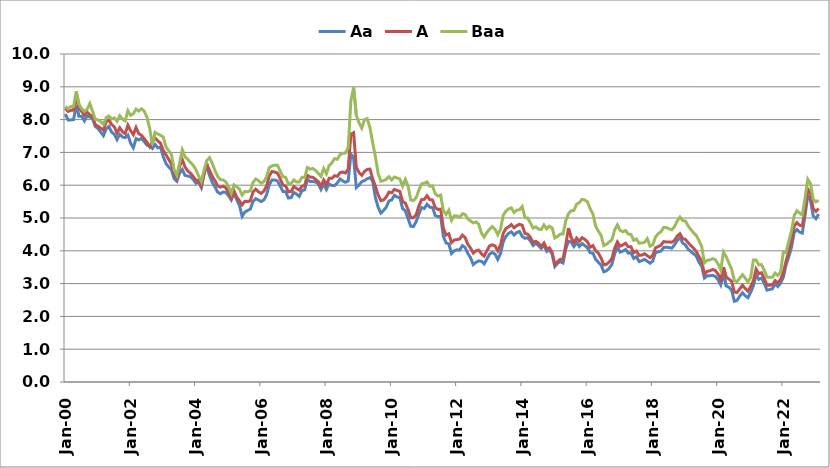
| Category | Aa | A | Baa |
|---|---|---|---|
| 2000-01-01 | 8.17 | 8.35 | 8.4 |
| 2000-02-01 | 7.99 | 8.25 | 8.33 |
| 2000-03-01 | 7.99 | 8.28 | 8.4 |
| 2000-04-01 | 8 | 8.29 | 8.4 |
| 2000-05-01 | 8.44 | 8.7 | 8.86 |
| 2000-06-01 | 8.1 | 8.36 | 8.47 |
| 2000-07-01 | 8.1 | 8.25 | 8.33 |
| 2000-08-01 | 7.96 | 8.13 | 8.25 |
| 2000-09-01 | 8.11 | 8.23 | 8.32 |
| 2000-10-01 | 8.08 | 8.14 | 8.49 |
| 2000-11-01 | 8.03 | 8.11 | 8.25 |
| 2000-12-01 | 7.79 | 7.84 | 8.01 |
| 2001-01-01 | 7.73 | 7.8 | 7.99 |
| 2001-02-01 | 7.62 | 7.74 | 7.94 |
| 2001-03-01 | 7.51 | 7.68 | 7.85 |
| 2001-04-01 | 7.72 | 7.94 | 8.06 |
| 2001-05-01 | 7.79 | 7.99 | 8.11 |
| 2001-06-01 | 7.62 | 7.85 | 8.02 |
| 2001-07-01 | 7.55 | 7.78 | 8.05 |
| 2001-08-01 | 7.39 | 7.59 | 7.95 |
| 2001-09-01 | 7.55 | 7.75 | 8.12 |
| 2001-10-01 | 7.47 | 7.63 | 8.02 |
| 2001-11-01 | 7.45 | 7.57 | 7.96 |
| 2001-12-01 | 7.53 | 7.83 | 8.27 |
| 2002-01-01 | 7.28 | 7.66 | 8.13 |
| 2002-02-01 | 7.14 | 7.54 | 8.18 |
| 2002-03-01 | 7.42 | 7.76 | 8.32 |
| 2002-04-01 | 7.38 | 7.57 | 8.26 |
| 2002-05-01 | 7.43 | 7.52 | 8.33 |
| 2002-06-01 | 7.33 | 7.42 | 8.26 |
| 2002-07-01 | 7.22 | 7.31 | 8.07 |
| 2002-08-01 | 7.2 | 7.17 | 7.74 |
| 2002-09-01 | 7.12 | 7.32 | 7.23 |
| 2002-10-01 | 7.24 | 7.44 | 7.61 |
| 2002-11-01 | 7.14 | 7.35 | 7.56 |
| 2002-12-01 | 7.16 | 7.28 | 7.52 |
| 2003-01-01 | 6.87 | 7.06 | 7.47 |
| 2003-02-01 | 6.66 | 6.93 | 7.17 |
| 2003-03-01 | 6.56 | 6.79 | 7.05 |
| 2003-04-01 | 6.47 | 6.64 | 6.94 |
| 2003-05-01 | 6.2 | 6.36 | 6.47 |
| 2003-06-01 | 6.12 | 6.21 | 6.3 |
| 2003-07-01 | 6.37 | 6.57 | 6.67 |
| 2003-08-01 | 6.48 | 6.78 | 7.08 |
| 2003-09-01 | 6.3 | 6.56 | 6.87 |
| 2003-10-01 | 6.28 | 6.43 | 6.79 |
| 2003-11-01 | 6.26 | 6.37 | 6.69 |
| 2003-12-01 | 6.18 | 6.27 | 6.61 |
| 2004-01-01 | 6.06 | 6.15 | 6.47 |
| 2004-02-01 | 6.1 | 6.15 | 6.28 |
| 2004-03-01 | 5.93 | 5.97 | 6.12 |
| 2004-04-01 | 6.33 | 6.35 | 6.46 |
| 2004-05-01 | 6.66 | 6.62 | 6.75 |
| 2004-06-01 | 6.3 | 6.46 | 6.84 |
| 2004-07-01 | 6.09 | 6.27 | 6.67 |
| 2004-08-01 | 5.95 | 6.14 | 6.45 |
| 2004-09-01 | 5.79 | 5.98 | 6.27 |
| 2004-10-01 | 5.74 | 5.94 | 6.17 |
| 2004-11-01 | 5.79 | 5.97 | 6.16 |
| 2004-12-01 | 5.78 | 5.92 | 6.1 |
| 2005-01-01 | 5.68 | 5.78 | 5.95 |
| 2005-02-01 | 5.55 | 5.61 | 5.76 |
| 2005-03-01 | 5.76 | 5.83 | 6.01 |
| 2005-04-01 | 5.56 | 5.64 | 5.95 |
| 2005-05-01 | 5.39 | 5.53 | 5.88 |
| 2005-06-01 | 5.05 | 5.4 | 5.7 |
| 2005-07-01 | 5.18 | 5.51 | 5.81 |
| 2005-08-01 | 5.23 | 5.5 | 5.8 |
| 2005-09-01 | 5.27 | 5.52 | 5.83 |
| 2005-10-01 | 5.5 | 5.79 | 6.08 |
| 2005-11-01 | 5.59 | 5.88 | 6.19 |
| 2005-12-01 | 5.55 | 5.8 | 6.14 |
| 2006-01-01 | 5.5 | 5.75 | 6.06 |
| 2006-02-01 | 5.55 | 5.82 | 6.11 |
| 2006-03-01 | 5.71 | 5.98 | 6.26 |
| 2006-04-01 | 6.02 | 6.29 | 6.54 |
| 2006-05-01 | 6.16 | 6.42 | 6.59 |
| 2006-06-01 | 6.16 | 6.4 | 6.61 |
| 2006-07-01 | 6.13 | 6.37 | 6.61 |
| 2006-08-01 | 5.97 | 6.2 | 6.43 |
| 2006-09-01 | 5.81 | 6 | 6.26 |
| 2006-10-01 | 5.8 | 5.98 | 6.24 |
| 2006-11-01 | 5.61 | 5.8 | 6.04 |
| 2006-12-01 | 5.62 | 5.81 | 6.05 |
| 2007-01-01 | 5.78 | 5.96 | 6.16 |
| 2007-02-01 | 5.73 | 5.9 | 6.1 |
| 2007-03-01 | 5.66 | 5.85 | 6.1 |
| 2007-04-01 | 5.83 | 5.97 | 6.24 |
| 2007-05-01 | 5.86 | 5.99 | 6.23 |
| 2007-06-01 | 6.18 | 6.3 | 6.54 |
| 2007-07-01 | 6.11 | 6.25 | 6.49 |
| 2007-08-01 | 6.11 | 6.24 | 6.51 |
| 2007-09-01 | 6.1 | 6.18 | 6.45 |
| 2007-10-01 | 6.04 | 6.11 | 6.36 |
| 2007-11-01 | 5.87 | 5.97 | 6.27 |
| 2007-12-01 | 6.03 | 6.16 | 6.51 |
| 2008-01-01 | 5.87 | 6.02 | 6.35 |
| 2008-02-01 | 6.04 | 6.21 | 6.6 |
| 2008-03-01 | 5.99 | 6.21 | 6.68 |
| 2008-04-01 | 5.99 | 6.29 | 6.81 |
| 2008-05-01 | 6.07 | 6.27 | 6.79 |
| 2008-06-01 | 6.19 | 6.38 | 6.93 |
| 2008-07-01 | 6.13 | 6.4 | 6.97 |
| 2008-08-01 | 6.09 | 6.37 | 6.98 |
| 2008-09-01 | 6.13 | 6.49 | 7.15 |
| 2008-10-01 | 6.95 | 7.56 | 8.58 |
| 2008-11-01 | 6.83 | 7.6 | 8.98 |
| 2008-12-01 | 5.93 | 6.54 | 8.13 |
| 2009-01-01 | 6.01 | 6.39 | 7.9 |
| 2009-02-01 | 6.11 | 6.3 | 7.74 |
| 2009-03-01 | 6.14 | 6.42 | 8 |
| 2009-04-01 | 6.2 | 6.48 | 8.03 |
| 2009-05-01 | 6.23 | 6.49 | 7.76 |
| 2009-06-01 | 6.13 | 6.2 | 7.3 |
| 2009-07-01 | 5.63 | 5.97 | 6.87 |
| 2009-08-01 | 5.33 | 5.71 | 6.36 |
| 2009-09-01 | 5.15 | 5.53 | 6.12 |
| 2009-10-01 | 5.23 | 5.55 | 6.14 |
| 2009-11-01 | 5.33 | 5.64 | 6.18 |
| 2009-12-01 | 5.52 | 5.79 | 6.26 |
| 2010-01-01 | 5.55 | 5.77 | 6.16 |
| 2010-02-01 | 5.69 | 5.87 | 6.25 |
| 2010-03-01 | 5.64 | 5.84 | 6.22 |
| 2010-04-01 | 5.62 | 5.81 | 6.19 |
| 2010-05-01 | 5.29 | 5.5 | 5.97 |
| 2010-06-01 | 5.22 | 5.46 | 6.18 |
| 2010-07-01 | 4.99 | 5.26 | 5.98 |
| 2010-08-01 | 4.75 | 5.01 | 5.55 |
| 2010-09-01 | 4.74 | 5.01 | 5.53 |
| 2010-10-01 | 4.89 | 5.1 | 5.62 |
| 2010-11-01 | 5.12 | 5.37 | 5.85 |
| 2010-12-01 | 5.32 | 5.56 | 6.04 |
| 2011-01-01 | 5.29 | 5.57 | 6.06 |
| 2011-02-01 | 5.42 | 5.68 | 6.1 |
| 2011-03-01 | 5.33 | 5.56 | 5.97 |
| 2011-04-01 | 5.32 | 5.55 | 5.98 |
| 2011-05-01 | 5.08 | 5.32 | 5.74 |
| 2011-06-01 | 5.04 | 5.26 | 5.67 |
| 2011-07-01 | 5.05 | 5.27 | 5.7 |
| 2011-08-01 | 4.44 | 4.69 | 5.22 |
| 2011-09-01 | 4.24 | 4.48 | 5.11 |
| 2011-10-01 | 4.21 | 4.52 | 5.24 |
| 2011-11-01 | 3.92 | 4.25 | 4.93 |
| 2011-12-01 | 4 | 4.33 | 5.07 |
| 2012-01-01 | 4.03 | 4.34 | 5.06 |
| 2012-02-01 | 4.02 | 4.36 | 5.02 |
| 2012-03-01 | 4.16 | 4.48 | 5.13 |
| 2012-04-01 | 4.1 | 4.4 | 5.11 |
| 2012-05-01 | 3.92 | 4.2 | 4.97 |
| 2012-06-01 | 3.79 | 4.08 | 4.91 |
| 2012-07-01 | 3.58 | 3.93 | 4.85 |
| 2012-08-01 | 3.65 | 4 | 4.88 |
| 2012-09-01 | 3.69 | 4.02 | 4.81 |
| 2012-10-01 | 3.68 | 3.91 | 4.54 |
| 2012-11-01 | 3.6 | 3.84 | 4.42 |
| 2012-12-01 | 3.75 | 4 | 4.56 |
| 2013-01-01 | 3.9 | 4.15 | 4.66 |
| 2013-02-01 | 3.95 | 4.18 | 4.74 |
| 2013-03-01 | 3.9 | 4.15 | 4.66 |
| 2013-04-01 | 3.74 | 4 | 4.49 |
| 2013-05-01 | 3.91 | 4.17 | 4.65 |
| 2013-06-01 | 4.27 | 4.53 | 5.08 |
| 2013-07-01 | 4.44 | 4.68 | 5.21 |
| 2013-08-01 | 4.53 | 4.73 | 5.28 |
| 2013-09-01 | 4.58 | 4.8 | 5.31 |
| 2013-10-01 | 4.48 | 4.7 | 5.17 |
| 2013-11-01 | 4.56 | 4.77 | 5.24 |
| 2013-12-01 | 4.59 | 4.81 | 5.25 |
| 2014-01-01 | 4.44 | 4.778 | 5.351 |
| 2014-02-01 | 4.38 | 4.53 | 5.01 |
| 2014-03-01 | 4.4 | 4.51 | 5 |
| 2014-04-01 | 4.3 | 4.41 | 4.85 |
| 2014-05-01 | 4.16 | 4.26 | 4.69 |
| 2014-06-01 | 4.23 | 4.29 | 4.73 |
| 2014-07-01 | 4.16 | 4.23 | 4.66 |
| 2014-08-01 | 4.07 | 4.13 | 4.65 |
| 2014-09-01 | 4.18 | 4.24 | 4.79 |
| 2014-10-01 | 3.98 | 4.06 | 4.67 |
| 2014-11-01 | 4.03 | 4.09 | 4.75 |
| 2014-12-01 | 3.9 | 3.95 | 4.7 |
| 2015-01-01 | 3.52 | 3.58 | 4.39 |
| 2015-02-01 | 3.62 | 3.67 | 4.44 |
| 2015-03-01 | 3.67 | 3.74 | 4.51 |
| 2015-04-01 | 3.63 | 3.75 | 4.51 |
| 2015-05-01 | 4.05 | 4.17 | 4.91 |
| 2015-06-01 | 4.29 | 4.69 | 5.13 |
| 2015-07-01 | 4.27 | 4.4 | 5.22 |
| 2015-08-01 | 4.13 | 4.25 | 5.23 |
| 2015-09-01 | 4.25 | 4.39 | 5.42 |
| 2015-10-01 | 4.13 | 4.29 | 5.47 |
| 2015-11-01 | 4.22 | 4.4 | 5.57 |
| 2015-12-01 | 4.16 | 4.35 | 5.55 |
| 2016-01-01 | 4.09 | 4.27 | 5.49 |
| 2016-02-01 | 3.94 | 4.11 | 5.28 |
| 2016-03-01 | 3.93 | 4.16 | 5.12 |
| 2016-04-01 | 3.74 | 4 | 4.75 |
| 2016-05-01 | 3.65 | 3.93 | 4.6 |
| 2016-06-01 | 3.56 | 3.78 | 4.47 |
| 2016-07-01 | 3.36 | 3.57 | 4.16 |
| 2016-08-01 | 3.39 | 3.59 | 4.2 |
| 2016-09-01 | 3.47 | 3.66 | 4.27 |
| 2016-10-01 | 3.59 | 3.77 | 4.34 |
| 2016-11-01 | 3.91 | 4.08 | 4.64 |
| 2016-12-01 | 4.11 | 4.27 | 4.79 |
| 2017-01-01 | 3.96 | 4.14 | 4.62 |
| 2017-02-01 | 3.99 | 4.18 | 4.58 |
| 2017-03-01 | 4.04 | 4.23 | 4.62 |
| 2017-04-01 | 3.93 | 4.12 | 4.51 |
| 2017-05-01 | 3.94 | 4.12 | 4.5 |
| 2017-06-01 | 3.77 | 3.94 | 4.32 |
| 2017-07-01 | 3.82 | 3.99 | 4.36 |
| 2017-08-01 | 3.67 | 3.86 | 4.23 |
| 2017-09-01 | 3.7 | 3.87 | 4.24 |
| 2017-10-01 | 3.74 | 3.91 | 4.26 |
| 2017-11-01 | 3.68 | 3.85 | 4.37 |
| 2017-12-01 | 3.62 | 3.79 | 4.14 |
| 2018-01-01 | 3.69 | 3.86 | 4.18 |
| 2018-02-01 | 3.94 | 4.09 | 4.42 |
| 2018-03-01 | 3.97 | 4.13 | 4.52 |
| 2018-04-01 | 3.99 | 4.17 | 4.58 |
| 2018-05-01 | 4.1 | 4.28 | 4.71 |
| 2018-06-01 | 4.11 | 4.27 | 4.71 |
| 2018-07-01 | 4.1 | 4.27 | 4.67 |
| 2018-08-01 | 4.08 | 4.26 | 4.64 |
| 2018-09-01 | 4.18 | 4.32 | 4.74 |
| 2018-10-01 | 4.31 | 4.45 | 4.91 |
| 2018-11-01 | 4.4 | 4.52 | 5.03 |
| 2018-12-01 | 4.24 | 4.37 | 4.92 |
| 2019-01-01 | 4.18 | 4.35 | 4.91 |
| 2019-02-01 | 4.05 | 4.25 | 4.76 |
| 2019-03-01 | 3.98 | 4.16 | 4.65 |
| 2019-04-01 | 3.91 | 4.08 | 4.55 |
| 2019-05-01 | 3.84 | 3.98 | 4.47 |
| 2019-06-01 | 3.65 | 3.82 | 4.31 |
| 2019-07-01 | 3.53 | 3.69 | 4.13 |
| 2019-08-01 | 3.17 | 3.29 | 3.63 |
| 2019-09-01 | 3.24 | 3.37 | 3.71 |
| 2019-10-01 | 3.24 | 3.39 | 3.72 |
| 2019-11-01 | 3.25 | 3.43 | 3.76 |
| 2019-12-01 | 3.22 | 3.4 | 3.73 |
| 2020-01-01 | 3.12 | 3.29 | 3.6 |
| 2020-02-01 | 2.96 | 3.11 | 3.42 |
| 2020-03-01 | 3.3 | 3.5 | 3.96 |
| 2020-04-01 | 2.93 | 3.19 | 3.82 |
| 2020-05-01 | 2.89 | 3.14 | 3.63 |
| 2020-06-01 | 2.8 | 3.07 | 3.44 |
| 2020-07-01 | 2.46 | 2.74 | 3.09 |
| 2020-08-01 | 2.49 | 2.73 | 3.06 |
| 2020-09-01 | 2.62 | 2.84 | 3.17 |
| 2020-10-01 | 2.72 | 2.95 | 3.27 |
| 2020-11-01 | 2.63 | 2.85 | 3.17 |
| 2020-12-01 | 2.57 | 2.77 | 3.05 |
| 2021-01-01 | 2.73 | 2.91 | 3.18 |
| 2021-02-01 | 2.93 | 3.09 | 3.72 |
| 2021-03-01 | 3.27 | 3.44 | 3.72 |
| 2021-04-01 | 3.13 | 3.3 | 3.57 |
| 2021-05-01 | 3.17 | 3.33 | 3.58 |
| 2021-06-01 | 3.01 | 3.16 | 3.41 |
| 2021-07-01 | 2.8 | 2.95 | 3.2 |
| 2021-08-01 | 2.82 | 2.95 | 3.19 |
| 2021-09-01 | 2.84 | 2.96 | 3.19 |
| 2021-10-01 | 2.99 | 3.09 | 3.32 |
| 2021-11-01 | 2.91 | 3.02 | 3.25 |
| 2021-12-01 | 3.01 | 3.13 | 3.35 |
| 2022-01-01 | 3.19 | 3.33 | 3.95 |
| 2022-02-01 | 3.56 | 3.68 | 3.95 |
| 2022-03-01 | 3.81 | 3.98 | 4.28 |
| 2022-04-01 | 4.1 | 4.32 | 4.61 |
| 2022-05-01 | 4.55 | 4.75 | 5.07 |
| 2022-06-01 | 4.65 | 4.86 | 5.22 |
| 2022-07-01 | 4.57 | 4.78 | 5.15 |
| 2022-08-01 | 4.54 | 4.76 | 5.09 |
| 2022-09-01 | 5.08 | 5.28 | 5.61 |
| 2022-10-01 | 5.68 | 5.88 | 6.18 |
| 2022-11-01 | 5.54 | 5.75 | 6.05 |
| 2022-12-01 | 5.06 | 5.28 | 5.57 |
| 2023-01-01 | 4.98 | 5.2 | 5.49 |
| 2023-02-01 | 5.12 | 5.29 | 5.54 |